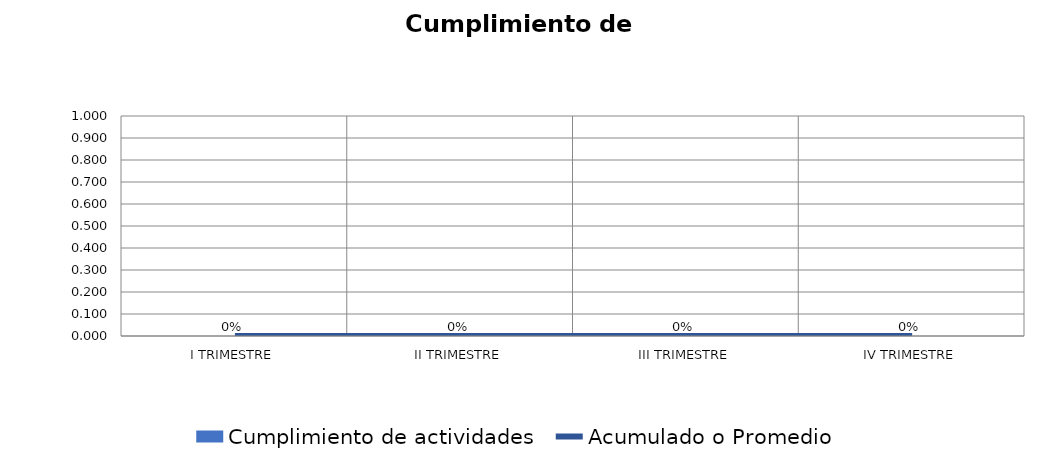
| Category | Cumplimiento de actividades |
|---|---|
| I TRIMESTRE | 0 |
| II TRIMESTRE | 0 |
| III TRIMESTRE | 0 |
| IV TRIMESTRE | 0 |